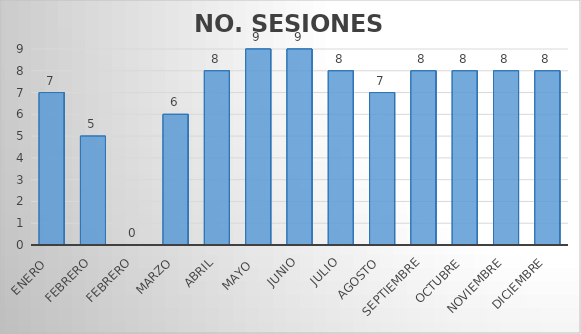
| Category | NO. SESIONES EFECTUADAS |
|---|---|
| Enero  | 7 |
| Febrero | 5 |
| Febrero | 0 |
| Marzo | 6 |
| Abril | 8 |
| Mayo  | 9 |
| Junio | 9 |
| Julio | 8 |
| Agosto | 7 |
| Septiembre | 8 |
| Octubre | 8 |
| Noviembre | 8 |
| Diciembre | 8 |